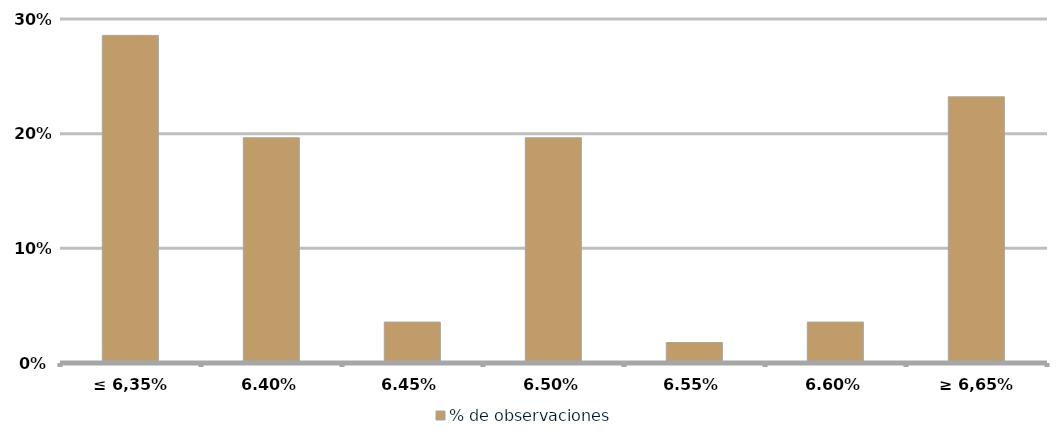
| Category | % de observaciones  |
|---|---|
| ≤ 6,35% | 0.286 |
| 6,40% | 0.196 |
| 6,45% | 0.036 |
| 6,50% | 0.196 |
| 6,55% | 0.018 |
| 6,60% | 0.036 |
| ≥ 6,65% | 0.232 |